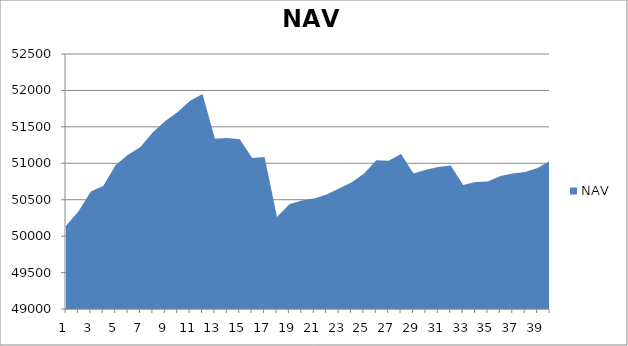
| Category | NAV |
|---|---|
| 0 | 50142.343 |
| 1 | 50336.57 |
| 2 | 50612.255 |
| 3 | 50687.913 |
| 4 | 50975.413 |
| 5 | 51115.874 |
| 6 | 51223.542 |
| 7 | 51427.364 |
| 8 | 51580.567 |
| 9 | 51704.692 |
| 10 | 51858.016 |
| 11 | 51951.766 |
| 12 | 51336.067 |
| 13 | 51345.356 |
| 14 | 51328.667 |
| 15 | 51072.985 |
| 16 | 51085.199 |
| 17 | 50261.67 |
| 18 | 50438.394 |
| 19 | 50489.896 |
| 20 | 50518.251 |
| 21 | 50572.468 |
| 22 | 50655.55 |
| 23 | 50737.787 |
| 24 | 50856.035 |
| 25 | 51041.806 |
| 26 | 51034.925 |
| 27 | 51128.589 |
| 28 | 50859.456 |
| 29 | 50911.137 |
| 30 | 50950.007 |
| 31 | 50970.175 |
| 32 | 50701.326 |
| 33 | 50743.495 |
| 34 | 50751.546 |
| 35 | 50826.725 |
| 36 | 50860.533 |
| 37 | 50879.283 |
| 38 | 50936.644 |
| 39 | 51031.381 |